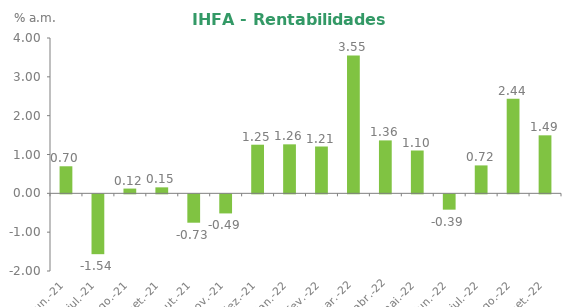
| Category | Series 0 |
|---|---|
| 2021-06-30 | 0.697 |
| 2021-07-31 | -1.541 |
| 2021-08-31 | 0.123 |
| 2021-09-30 | 0.154 |
| 2021-10-29 | -0.731 |
| 2021-11-30 | -0.492 |
| 2021-12-31 | 1.252 |
| 2022-01-31 | 1.262 |
| 2022-02-25 | 1.206 |
| 2022-03-31 | 3.55 |
| 2022-04-29 | 1.363 |
| 2022-05-31 | 1.103 |
| 2022-06-30 | -0.395 |
| 2022-07-29 | 0.719 |
| 2022-08-31 | 2.435 |
| 2022-09-30 | 1.494 |